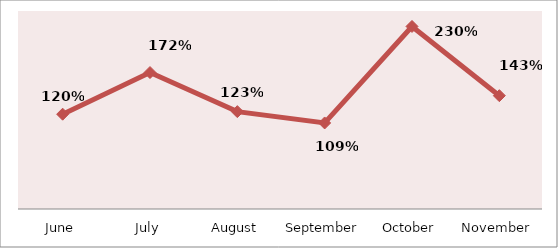
| Category | PERCENTAGE |
|---|---|
| June | 1.197 |
| July | 1.723 |
| August | 1.229 |
| September | 1.086 |
| October | 2.305 |
| November | 1.431 |